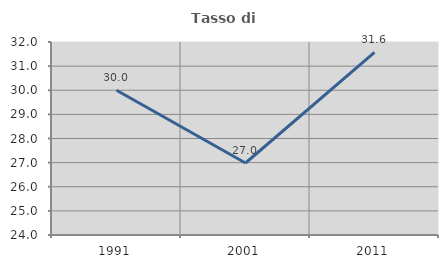
| Category | Tasso di occupazione   |
|---|---|
| 1991.0 | 30 |
| 2001.0 | 26.984 |
| 2011.0 | 31.572 |